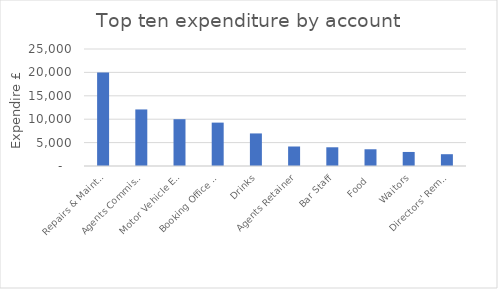
| Category | Total |
|---|---|
| Repairs & Maintenance | 20000 |
| Agents Commission | 12083.33 |
| Motor Vehicle Expenses | 10000 |
| Booking Office Rent | 9270.83 |
| Drinks | 6958.34 |
| Agents Retainer | 4166.7 |
| Bar Staff | 4000 |
| Food | 3575 |
| Waitors | 3000 |
| Directors' Remuneration | 2520 |